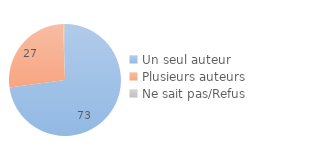
| Category | Series 0 |
|---|---|
| Un seul auteur | 72.836 |
| Plusieurs auteurs | 26.611 |
| Ne sait pas/Refus | 0.553 |